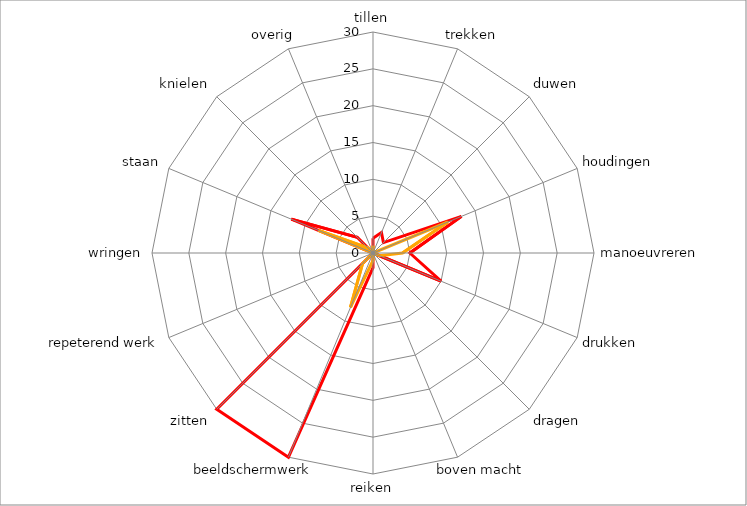
| Category | Series 0 | Series 1 |
|---|---|---|
| 0 | 2 | 1 |
| 1 | 3 | 0 |
| 2 | 2 | 0 |
| 3 | 13 | 11 |
| 4 | 5 | 4 |
| 5 | 10 | 1 |
| 6 | 0 | 0 |
| 7 | 0 | 0 |
| 8 | 2 | 1 |
| 9 | 30 | 8 |
| 10 | 30 | 2 |
| 11 | 0 | 0 |
| 12 | 0 | 0 |
| 13 | 12 | 8 |
| 14 | 3 | 1 |
| 15 | 0 | 0 |